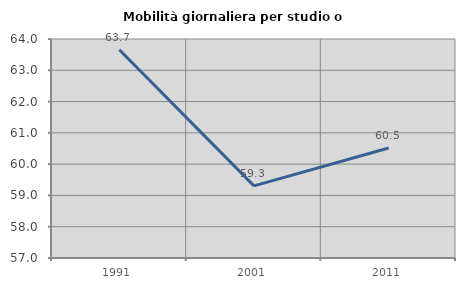
| Category | Mobilità giornaliera per studio o lavoro |
|---|---|
| 1991.0 | 63.659 |
| 2001.0 | 59.304 |
| 2011.0 | 60.516 |